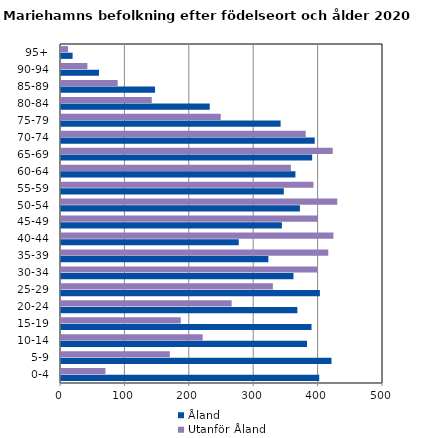
| Category | Åland | Utanför Åland |
|---|---|---|
| 0-4 | 401 | 69 |
| 5-9 | 420 | 169 |
| 10-14 | 382 | 220 |
| 15-19 | 389 | 186 |
| 20-24 | 367 | 265 |
| 25-29 | 402 | 329 |
| 30-34 | 361 | 398 |
| 35-39 | 322 | 415 |
| 40-44 | 276 | 423 |
| 45-49 | 343 | 399 |
| 50-54 | 371 | 429 |
| 55-59 | 346 | 392 |
| 60-64 | 364 | 357 |
| 65-69 | 390 | 422 |
| 70-74 | 394 | 380 |
| 75-79 | 341 | 248 |
| 80-84 | 231 | 141 |
| 85-89 | 146 | 88 |
| 90-94 | 59 | 41 |
| 95+ | 18 | 11 |